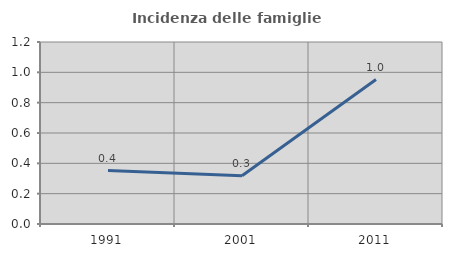
| Category | Incidenza delle famiglie numerose |
|---|---|
| 1991.0 | 0.352 |
| 2001.0 | 0.318 |
| 2011.0 | 0.952 |